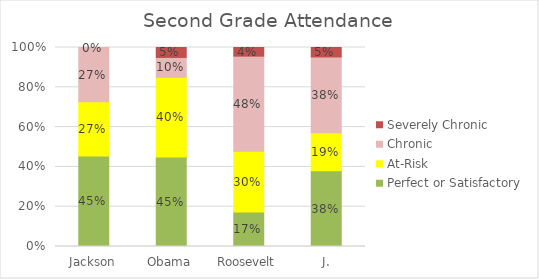
| Category | Perfect or Satisfactory | At-Risk | Chronic | Severely Chronic |
|---|---|---|---|---|
| Jackson | 0.455 | 0.273 | 0.273 | 0 |
| Obama | 0.45 | 0.4 | 0.1 | 0.05 |
| Roosevelt, J. | 0.174 | 0.304 | 0.478 | 0.043 |
| Taft | 0.381 | 0.19 | 0.381 | 0.048 |